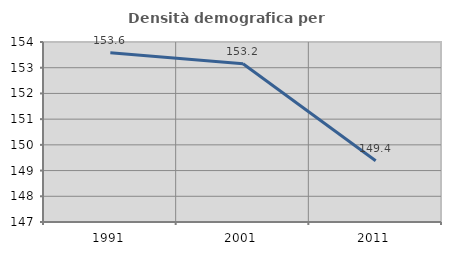
| Category | Densità demografica |
|---|---|
| 1991.0 | 153.581 |
| 2001.0 | 153.152 |
| 2011.0 | 149.384 |